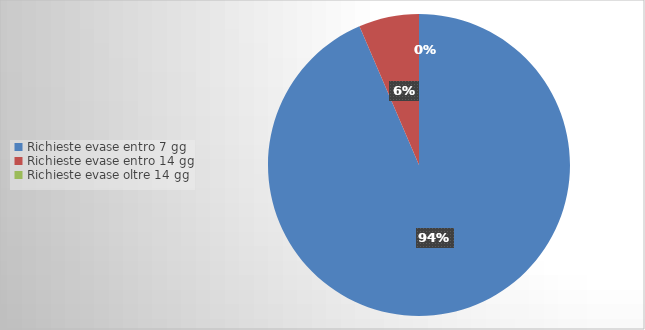
| Category | Series 0 |
|---|---|
| Richieste evase entro 7 gg | 29 |
| Richieste evase entro 14 gg | 2 |
| Richieste evase oltre 14 gg | 0 |